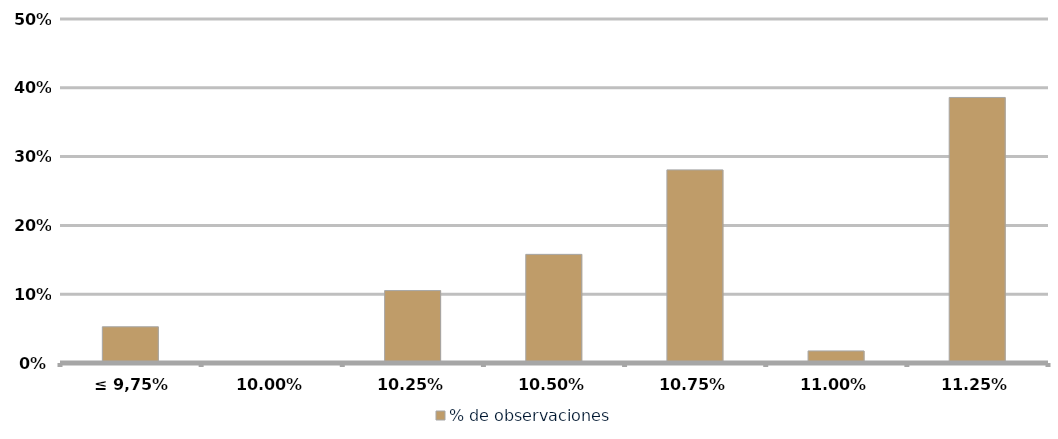
| Category | % de observaciones  |
|---|---|
| ≤ 9,75% | 0.053 |
| 10,00% | 0 |
| 10,25% | 0.105 |
| 10,50% | 0.158 |
| 10,75% | 0.281 |
| 11,00% | 0.018 |
| 11,25% | 0.386 |